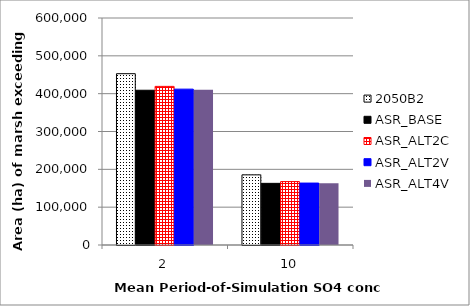
| Category | 2050B2 | ASR_BASE | ASR_ALT2C | ASR_ALT2V | ASR_ALT4V |
|---|---|---|---|---|---|
| 2.0 | 452800 | 409050 | 419250 | 412000 | 410375 |
| 10.0 | 185425 | 162950 | 167675 | 163700 | 163175 |